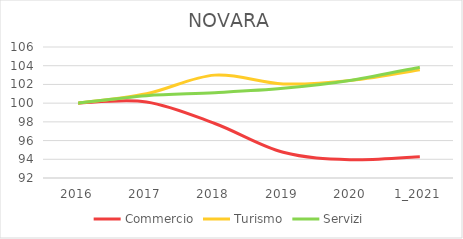
| Category | Commercio | Turismo | Servizi |
|---|---|---|---|
| 2016 | 100 | 100 | 100 |
| 2017 | 100.13 | 100.998 | 100.801 |
| 2018 | 97.826 | 102.994 | 101.116 |
| 2019 | 94.744 | 102.059 | 101.582 |
| 2020 | 93.955 | 102.433 | 102.454 |
| 1_2021 | 94.268 | 103.556 | 103.843 |